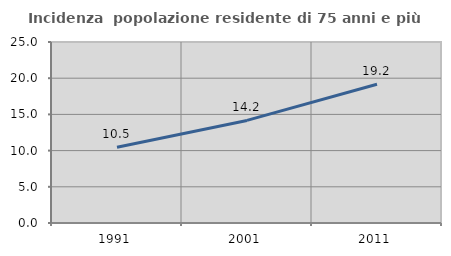
| Category | Incidenza  popolazione residente di 75 anni e più |
|---|---|
| 1991.0 | 10.463 |
| 2001.0 | 14.168 |
| 2011.0 | 19.159 |